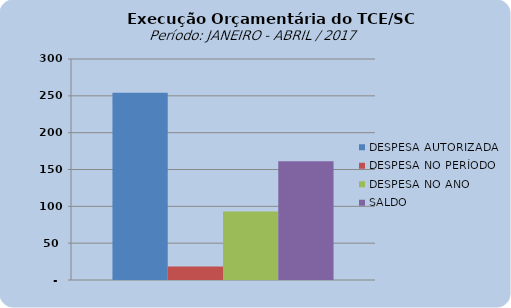
| Category | DESPESA AUTORIZADA | DESPESA NO PERÍODO | DESPESA NO ANO | SALDO |
|---|---|---|---|---|
| 0 | 254066003.19 | 18482896.64 | 93006295.7 | 161059707.49 |